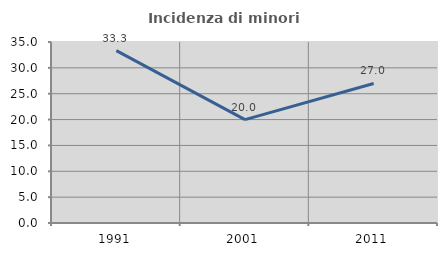
| Category | Incidenza di minori stranieri |
|---|---|
| 1991.0 | 33.333 |
| 2001.0 | 20 |
| 2011.0 | 26.984 |